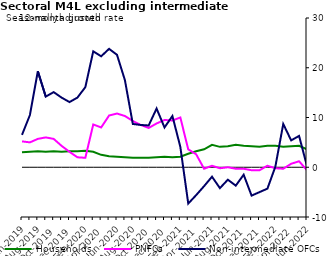
| Category | zero | Households | PNFCs | Non-intermediate OFCs |
|---|---|---|---|---|
| Jun-2019 | 0 | 3 | 5.2 | 6.5 |
| Jul-2019 | 0 | 3.1 | 5 | 10.5 |
| Aug-2019 | 0 | 3.2 | 5.7 | 19.3 |
| Sep-2019 | 0 | 3.1 | 6 | 14.2 |
| Oct-2019 | 0 | 3.2 | 5.7 | 15.1 |
| Nov-2019 | 0 | 3.1 | 4.3 | 14 |
| Dec-2019 | 0 | 3.2 | 3.1 | 13.1 |
| Jan-2020 | 0 | 3.2 | 2 | 14 |
| Feb-2020 | 0 | 3.3 | 1.9 | 16.1 |
| Mar-2020 | 0 | 3.1 | 8.6 | 23.3 |
| Apr-2020 | 0 | 2.5 | 8 | 22.3 |
| May-2020 | 0 | 2.2 | 10.4 | 23.8 |
| Jun-2020 | 0 | 2.1 | 10.8 | 22.6 |
| Jul-2020 | 0 | 2 | 10.3 | 17.5 |
| Aug-2020 | 0 | 1.9 | 9.3 | 8.7 |
| Sep-2020 | 0 | 1.9 | 8.5 | 8.5 |
| Oct-2020 | 0 | 1.9 | 7.9 | 8.4 |
| Nov-2020 | 0 | 2 | 8.8 | 11.8 |
| Dec-2020 | 0 | 2.1 | 9.5 | 8 |
| Jan-2021 | 0 | 2 | 9.4 | 10.3 |
| Feb-2021 | 0 | 2.1 | 10 | 4.1 |
| Mar-2021 | 0 | 2.7 | 3.6 | -7.3 |
| Apr-2021 | 0 | 3.2 | 2.6 | -5.6 |
| May-2021 | 0 | 3.6 | -0.3 | -3.8 |
| Jun-2021 | 0 | 4.5 | 0.3 | -1.9 |
| Jul-2021 | 0 | 4.1 | -0.2 | -4.2 |
| Aug-2021 | 0 | 4.2 | 0 | -2.5 |
| Sep-2021 | 0 | 4.5 | -0.3 | -3.7 |
| Oct-2021 | 0 | 4.3 | -0.3 | -1.5 |
| Nov-2021 | 0 | 4.2 | -0.6 | -5.7 |
| Dec-2021 | 0 | 4.1 | -0.6 | -5 |
| Jan-2022 | 0 | 4.3 | 0.3 | -4.3 |
| Feb-2022 | 0 | 4.3 | -0.2 | 0.1 |
| Mar-2022 | 0 | 4.1 | -0.3 | 8.7 |
| Apr-2022 | 0 | 4.2 | 0.7 | 5.4 |
| May-2022 | 0 | 4.3 | 1.2 | 6.3 |
| Jun-2022 | 0 | 3.6 | -0.6 | 0.2 |